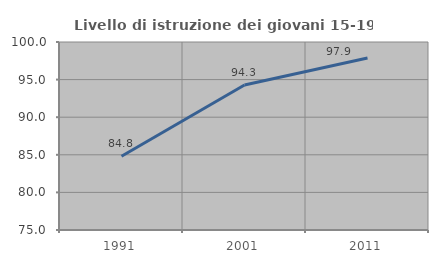
| Category | Livello di istruzione dei giovani 15-19 anni |
|---|---|
| 1991.0 | 84.814 |
| 2001.0 | 94.28 |
| 2011.0 | 97.861 |